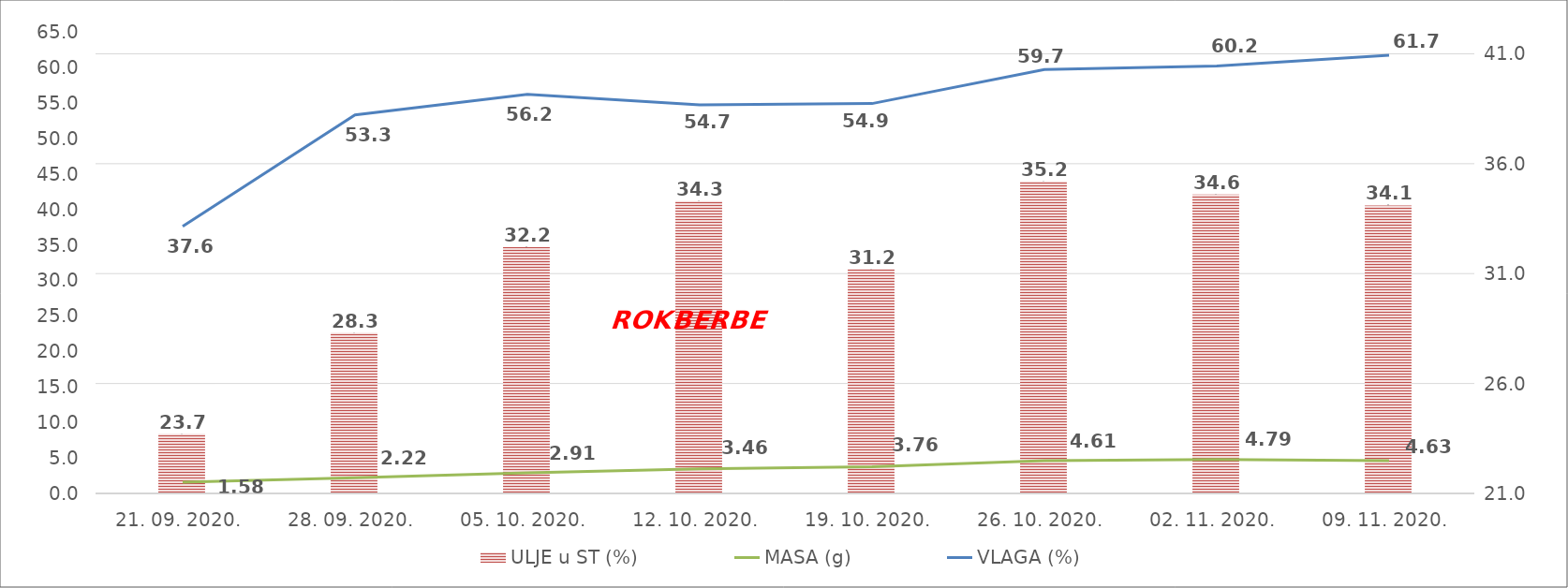
| Category | ULJE u ST (%) |
|---|---|
| 21. 09. 2020. | 23.7 |
| 28. 09. 2020. | 28.3 |
| 05. 10. 2020. | 32.2 |
| 12. 10. 2020. | 34.3 |
| 19. 10. 2020. | 31.2 |
| 26. 10. 2020. | 35.2 |
| 02. 11. 2020. | 34.6 |
| 09. 11. 2020. | 34.1 |